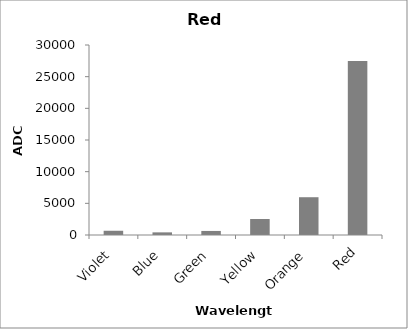
| Category | Red LED |
|---|---|
| Violet | 670 |
| Blue | 417 |
| Green | 640 |
| Yellow | 2530 |
| Orange | 5965 |
| Red | 27461 |